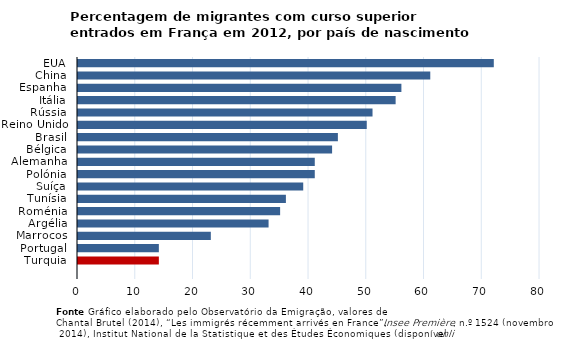
| Category | Series 0 |
|---|---|
| EUA | 72 |
| China | 61 |
| Espanha | 56 |
| Itália | 55 |
| Rússia | 51 |
| Reino Unido | 50 |
| Brasil | 45 |
| Bélgica | 44 |
| Alemanha | 41 |
| Polónia | 41 |
| Suíça | 39 |
| Tunísia | 36 |
| Roménia | 35 |
| Argélia | 33 |
| Marrocos | 23 |
| Portugal | 14 |
| Turquia | 14 |